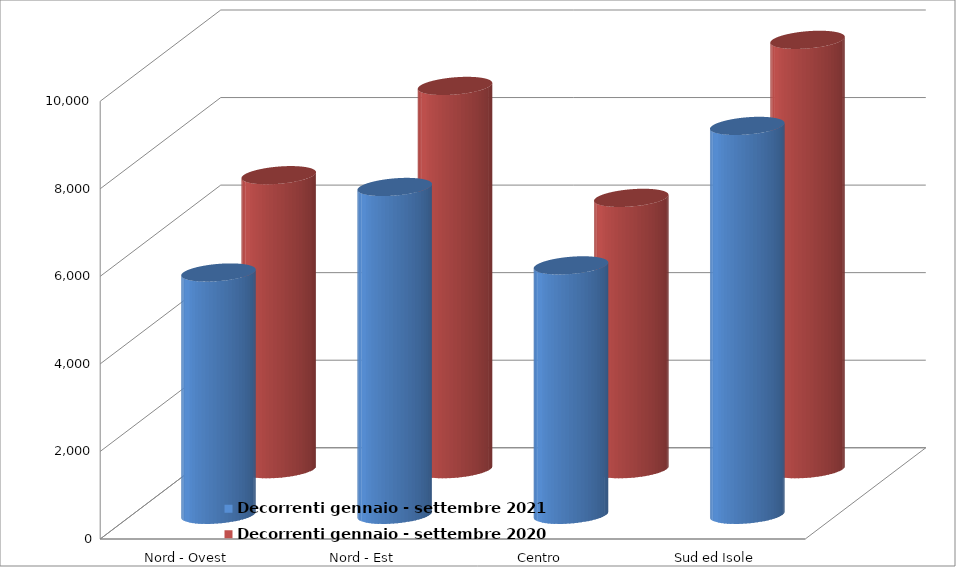
| Category | Decorrenti gennaio - settembre 2021 | Decorrenti gennaio - settembre 2020 |
|---|---|---|
| Nord - Ovest | 5535 | 6716 |
| Nord - Est | 7489 | 8755 |
| Centro | 5698 | 6198 |
| Sud ed Isole | 8884 | 9808 |